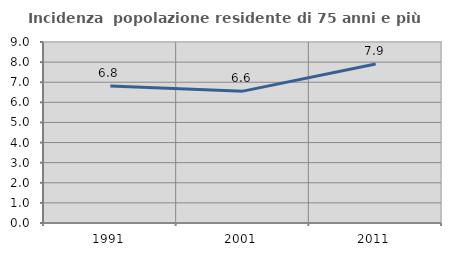
| Category | Incidenza  popolazione residente di 75 anni e più |
|---|---|
| 1991.0 | 6.806 |
| 2001.0 | 6.556 |
| 2011.0 | 7.905 |